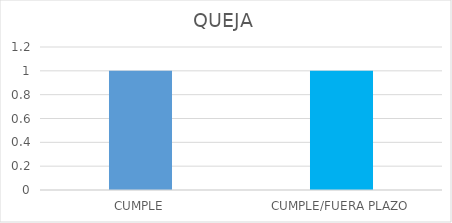
| Category | TOTAL |
|---|---|
| CUMPLE | 1 |
| CUMPLE/FUERA PLAZO | 1 |